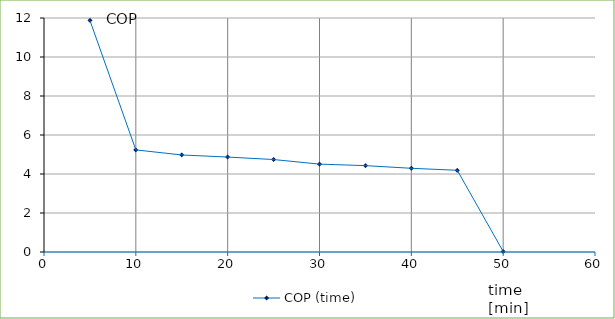
| Category | COP (time) |
|---|---|
| 5.0 | 11.878 |
| 10.0 | 5.236 |
| 15.0 | 4.976 |
| 20.0 | 4.869 |
| 25.0 | 4.742 |
| 30.0 | 4.507 |
| 35.0 | 4.429 |
| 40.0 | 4.293 |
| 45.0 | 4.191 |
| 50.0 | 0.027 |